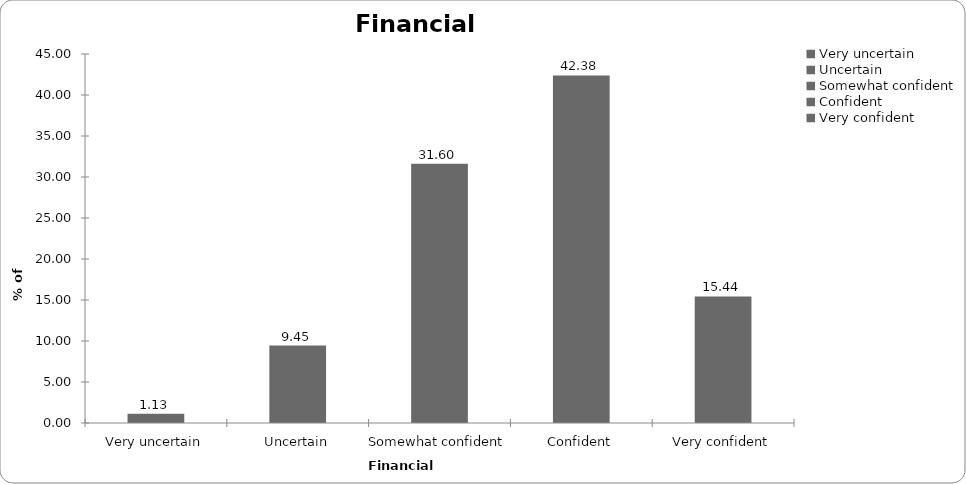
| Category | Financial confidence |
|---|---|
| Very uncertain | 1.131 |
| Uncertain | 9.448 |
| Somewhat confident | 31.603 |
| Confident | 42.382 |
| Very confident | 15.436 |